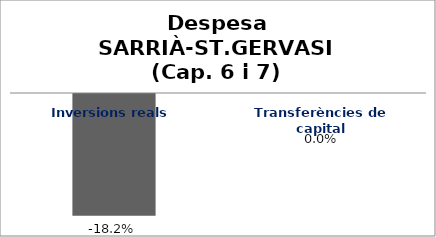
| Category | Series 0 |
|---|---|
| Inversions reals | -0.182 |
| Transferències de capital | 0 |